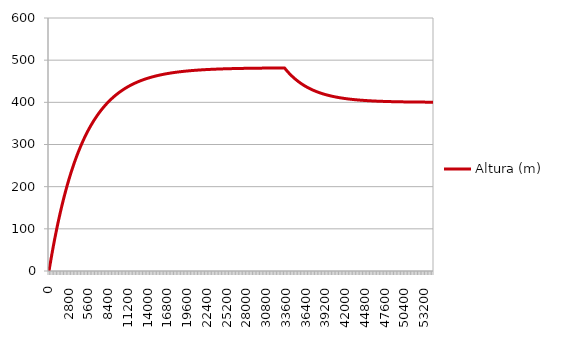
| Category | Altura (m) |
|---|---|
| 0 | 0 |
| 200 | 20 |
| 400 | 39.17 |
| 600 | 57.544 |
| 800 | 75.156 |
| 1000 | 92.037 |
| 1200 | 108.218 |
| 1400 | 123.727 |
| 1600 | 138.592 |
| 1800 | 152.84 |
| 2000 | 166.497 |
| 2200 | 179.587 |
| 2400 | 192.134 |
| 2600 | 204.161 |
| 2800 | 215.688 |
| 3000 | 226.737 |
| 3200 | 237.327 |
| 3400 | 247.478 |
| 3600 | 257.207 |
| 3800 | 266.533 |
| 4000 | 275.472 |
| 4200 | 284.039 |
| 4400 | 292.251 |
| 4600 | 300.123 |
| 4800 | 307.668 |
| 5000 | 314.899 |
| 5200 | 321.831 |
| 5400 | 328.474 |
| 5600 | 334.842 |
| 5800 | 340.946 |
| 6000 | 346.797 |
| 6200 | 352.404 |
| 6400 | 357.779 |
| 6600 | 362.931 |
| 6800 | 367.869 |
| 7000 | 372.603 |
| 7200 | 377.139 |
| 7400 | 381.488 |
| 7600 | 385.656 |
| 7800 | 389.651 |
| 8000 | 393.48 |
| 8200 | 397.15 |
| 8400 | 400.668 |
| 8600 | 404.04 |
| 8800 | 407.272 |
| 9000 | 410.37 |
| 9200 | 413.34 |
| 9400 | 416.186 |
| 9600 | 418.914 |
| 9800 | 421.528 |
| 10000 | 424.035 |
| 10200 | 426.437 |
| 10400 | 428.739 |
| 10600 | 430.946 |
| 10800 | 433.062 |
| 11000 | 435.09 |
| 11200 | 437.033 |
| 11400 | 438.896 |
| 11600 | 440.681 |
| 11800 | 442.393 |
| 12000 | 444.033 |
| 12200 | 445.605 |
| 12400 | 447.112 |
| 12600 | 448.557 |
| 12800 | 449.942 |
| 13000 | 451.269 |
| 13200 | 452.541 |
| 13400 | 453.76 |
| 13600 | 454.929 |
| 13800 | 456.049 |
| 14000 | 457.122 |
| 14200 | 458.151 |
| 14400 | 459.138 |
| 14600 | 460.083 |
| 14800 | 460.99 |
| 15000 | 461.858 |
| 15200 | 462.691 |
| 15400 | 463.489 |
| 15600 | 464.254 |
| 15800 | 464.987 |
| 16000 | 465.689 |
| 16200 | 466.363 |
| 16400 | 467.009 |
| 16600 | 467.627 |
| 16800 | 468.221 |
| 17000 | 468.789 |
| 17200 | 469.334 |
| 17400 | 469.856 |
| 17600 | 470.357 |
| 17800 | 470.837 |
| 18000 | 471.297 |
| 18200 | 471.738 |
| 18400 | 472.16 |
| 18600 | 472.565 |
| 18800 | 472.953 |
| 19000 | 473.325 |
| 19200 | 473.682 |
| 19400 | 474.024 |
| 19600 | 474.352 |
| 19800 | 474.666 |
| 20000 | 474.967 |
| 20200 | 475.255 |
| 20400 | 475.532 |
| 20600 | 475.797 |
| 20800 | 476.051 |
| 21000 | 476.295 |
| 21200 | 476.528 |
| 21400 | 476.752 |
| 21600 | 476.966 |
| 21800 | 477.172 |
| 22000 | 477.369 |
| 22200 | 477.558 |
| 22400 | 477.739 |
| 22600 | 477.912 |
| 22800 | 478.078 |
| 23000 | 478.238 |
| 23200 | 478.391 |
| 23400 | 478.537 |
| 23600 | 478.677 |
| 23800 | 478.812 |
| 24000 | 478.941 |
| 24200 | 479.065 |
| 24400 | 479.183 |
| 24600 | 479.297 |
| 24800 | 479.405 |
| 25000 | 479.51 |
| 25200 | 479.61 |
| 25400 | 479.706 |
| 25600 | 479.798 |
| 25800 | 479.886 |
| 26000 | 479.97 |
| 26200 | 480.051 |
| 26400 | 480.128 |
| 26600 | 480.203 |
| 26800 | 480.274 |
| 27000 | 480.342 |
| 27200 | 480.408 |
| 27400 | 480.47 |
| 27600 | 480.531 |
| 27800 | 480.588 |
| 28000 | 480.643 |
| 28200 | 480.696 |
| 28400 | 480.747 |
| 28600 | 480.796 |
| 28800 | 480.842 |
| 29000 | 480.887 |
| 29200 | 480.93 |
| 29400 | 480.971 |
| 29600 | 481.01 |
| 29800 | 481.048 |
| 30000 | 481.084 |
| 30200 | 481.119 |
| 30400 | 481.152 |
| 30600 | 481.184 |
| 30800 | 481.215 |
| 31000 | 481.244 |
| 31200 | 481.272 |
| 31400 | 481.299 |
| 31600 | 481.324 |
| 31800 | 481.349 |
| 32000 | 481.373 |
| 32200 | 481.396 |
| 32400 | 481.417 |
| 32600 | 481.438 |
| 32800 | 481.458 |
| 33000 | 481.477 |
| 33200 | 481.496 |
| 33400 | 481.513 |
| 33600 | 477.437 |
| 33800 | 473.566 |
| 34000 | 469.887 |
| 34200 | 466.393 |
| 34400 | 463.073 |
| 34600 | 459.92 |
| 34800 | 456.924 |
| 35000 | 454.077 |
| 35200 | 451.374 |
| 35400 | 448.805 |
| 35600 | 446.365 |
| 35800 | 444.046 |
| 36000 | 441.844 |
| 36200 | 439.752 |
| 36400 | 437.764 |
| 36600 | 435.876 |
| 36800 | 434.082 |
| 37000 | 432.378 |
| 37200 | 430.759 |
| 37400 | 429.221 |
| 37600 | 427.76 |
| 37800 | 426.372 |
| 38000 | 425.054 |
| 38200 | 423.801 |
| 38400 | 422.611 |
| 38600 | 421.48 |
| 38800 | 420.406 |
| 39000 | 419.386 |
| 39200 | 418.417 |
| 39400 | 417.496 |
| 39600 | 416.621 |
| 39800 | 415.79 |
| 40000 | 415.001 |
| 40200 | 414.251 |
| 40400 | 413.538 |
| 40600 | 412.861 |
| 40800 | 412.218 |
| 41000 | 411.607 |
| 41200 | 411.027 |
| 41400 | 410.475 |
| 41600 | 409.952 |
| 41800 | 409.454 |
| 42000 | 408.981 |
| 42200 | 408.532 |
| 42400 | 408.106 |
| 42600 | 407.7 |
| 42800 | 407.315 |
| 43000 | 406.95 |
| 43200 | 406.602 |
| 43400 | 406.272 |
| 43600 | 405.958 |
| 43800 | 405.661 |
| 44000 | 405.377 |
| 44200 | 405.109 |
| 44400 | 404.853 |
| 44600 | 404.611 |
| 44800 | 404.38 |
| 45000 | 404.161 |
| 45200 | 403.953 |
| 45400 | 403.755 |
| 45600 | 403.568 |
| 45800 | 403.389 |
| 46000 | 403.22 |
| 46200 | 403.059 |
| 46400 | 402.906 |
| 46600 | 402.76 |
| 46800 | 402.622 |
| 47000 | 402.491 |
| 47200 | 402.367 |
| 47400 | 402.248 |
| 47600 | 402.136 |
| 47800 | 402.029 |
| 48000 | 401.928 |
| 48200 | 401.831 |
| 48400 | 401.74 |
| 48600 | 401.653 |
| 48800 | 401.57 |
| 49000 | 401.492 |
| 49200 | 401.417 |
| 49400 | 401.346 |
| 49600 | 401.279 |
| 49800 | 401.215 |
| 50000 | 401.154 |
| 50200 | 401.097 |
| 50400 | 401.042 |
| 50600 | 400.99 |
| 50800 | 400.94 |
| 51000 | 400.893 |
| 51200 | 400.848 |
| 51400 | 400.806 |
| 51600 | 400.766 |
| 51800 | 400.727 |
| 52000 | 400.691 |
| 52200 | 400.657 |
| 52400 | 400.624 |
| 52600 | 400.593 |
| 52800 | 400.563 |
| 53000 | 400.535 |
| 53200 | 400.508 |
| 53400 | 400.483 |
| 53600 | 400.458 |
| 53800 | 400.436 |
| 54000 | 400.414 |
| 54200 | 400.393 |
| 54400 | 400.373 |
| 54600 | 400.355 |